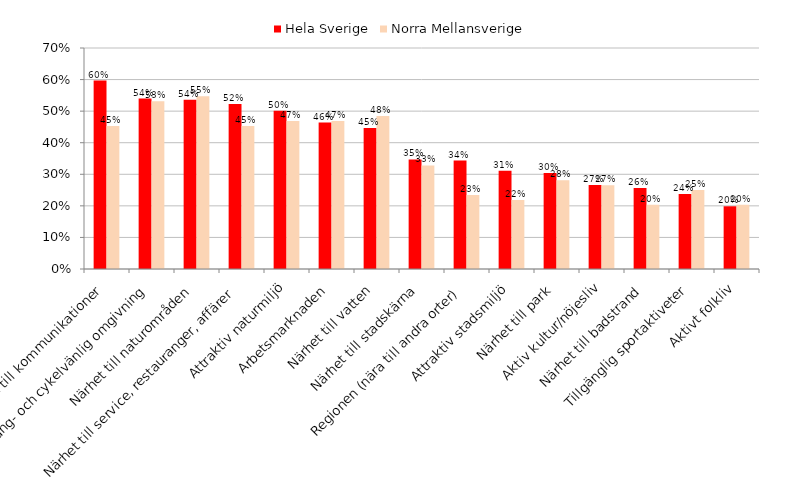
| Category | Hela Sverige | Norra Mellansverige |
|---|---|---|
| Närhet till kommunikationer | 0.597 | 0.453 |
| Gång- och cykelvänlig omgivning | 0.54 | 0.531 |
| Närhet till naturområden | 0.536 | 0.547 |
| Närhet till service, restauranger, affärer | 0.523 | 0.453 |
| Attraktiv naturmiljö | 0.501 | 0.469 |
| Arbetsmarknaden | 0.464 | 0.469 |
| Närhet till vatten | 0.446 | 0.484 |
| Närhet till stadskärna | 0.347 | 0.328 |
| Regionen (nära till andra orter) | 0.343 | 0.234 |
|  Attraktiv stadsmiljö | 0.311 | 0.219 |
| Närhet till park | 0.304 | 0.281 |
| Aktiv kultur/nöjesliv | 0.266 | 0.266 |
| Närhet till badstrand | 0.257 | 0.203 |
| Tillgänglig sportaktiveter | 0.237 | 0.25 |
| Aktivt folkliv | 0.199 | 0.203 |